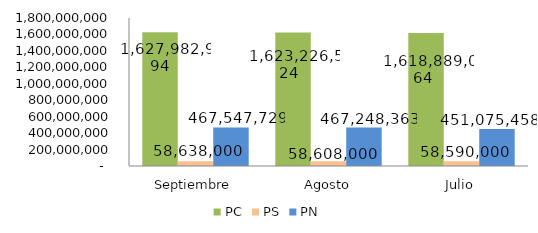
| Category | PC | PS | PN |
|---|---|---|---|
| Septiembre | 1627982994.29 | 58638000 | 467547728.51 |
| Agosto | 1623226524.2 | 58608000 | 467248363.23 |
| Julio | 1618889063.7 | 58590000 | 451075457.5 |